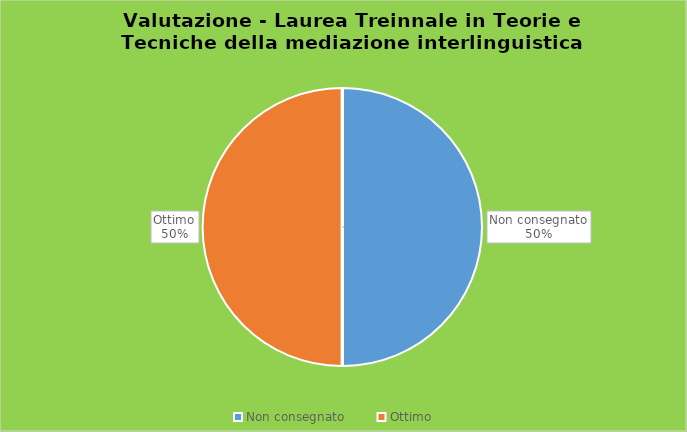
| Category | Series 0 |
|---|---|
| Non consegnato | 1 |
| Ottimo | 1 |